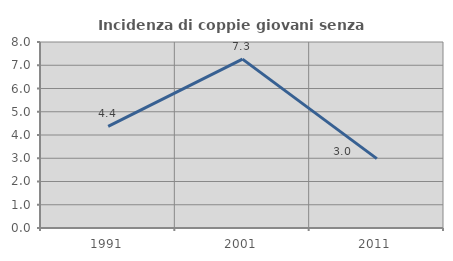
| Category | Incidenza di coppie giovani senza figli |
|---|---|
| 1991.0 | 4.372 |
| 2001.0 | 7.263 |
| 2011.0 | 2.985 |